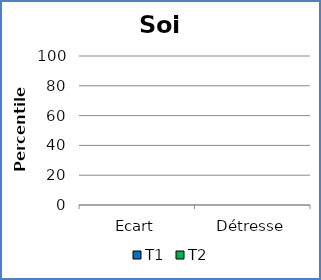
| Category | T1 | T2 |
|---|---|---|
| Ecart | 0 | 0 |
| Détresse | 0 | 0 |